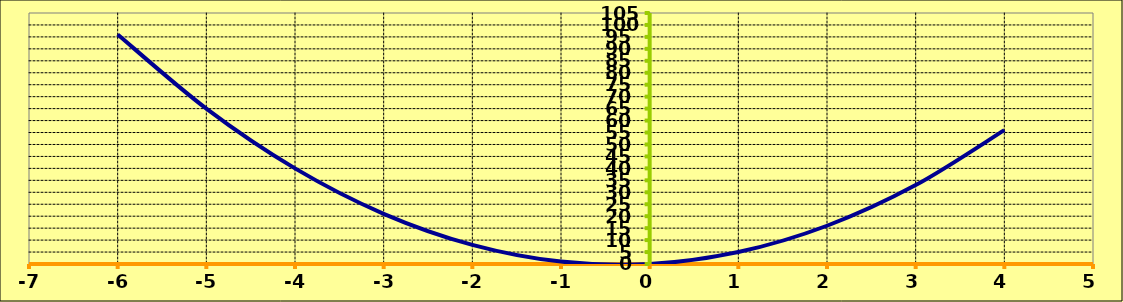
| Category | Series 0 |
|---|---|
| -6.0 | 96 |
| -5.0 | 65 |
| -4.0 | 40 |
| -3.0 | 21 |
| -2.0 | 8 |
| -1.0 | 1 |
| 0.0 | 0 |
| 1.0 | 5 |
| 2.0 | 16 |
| 3.0 | 33 |
| 4.0 | 56 |